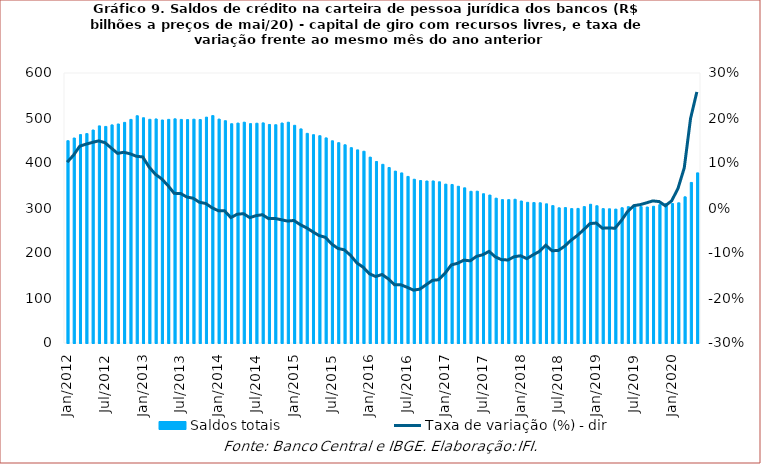
| Category | Saldos totais |
|---|---|
| 2012-01-01 | 449520.722 |
| 2012-02-01 | 455551.553 |
| 2012-03-01 | 463106.888 |
| 2012-04-01 | 465357.991 |
| 2012-05-01 | 473297.544 |
| 2012-06-01 | 482456.472 |
| 2012-07-01 | 481275.551 |
| 2012-08-01 | 484661.368 |
| 2012-09-01 | 486735.577 |
| 2012-10-01 | 490306.154 |
| 2012-11-01 | 496904.44 |
| 2012-12-01 | 505027.411 |
| 2013-01-01 | 500543.018 |
| 2013-02-01 | 497140.703 |
| 2013-03-01 | 497882.756 |
| 2013-04-01 | 495564.796 |
| 2013-05-01 | 496972.941 |
| 2013-06-01 | 498158.016 |
| 2013-07-01 | 496830.326 |
| 2013-08-01 | 496494.828 |
| 2013-09-01 | 497350.198 |
| 2013-10-01 | 496574.227 |
| 2013-11-01 | 501893.82 |
| 2013-12-01 | 505313.9 |
| 2014-01-01 | 497538.409 |
| 2014-02-01 | 493976.41 |
| 2014-03-01 | 487267.089 |
| 2014-04-01 | 488702.93 |
| 2014-05-01 | 490690.538 |
| 2014-06-01 | 487501.077 |
| 2014-07-01 | 488387.025 |
| 2014-08-01 | 489110.746 |
| 2014-09-01 | 485590.829 |
| 2014-10-01 | 485049.859 |
| 2014-11-01 | 488806.976 |
| 2014-12-01 | 490628.91 |
| 2015-01-01 | 483769.554 |
| 2015-02-01 | 475777.7 |
| 2015-03-01 | 465870.388 |
| 2015-04-01 | 462899.902 |
| 2015-05-01 | 460663.857 |
| 2015-06-01 | 455766.111 |
| 2015-07-01 | 449345.375 |
| 2015-08-01 | 445150.156 |
| 2015-09-01 | 440480.486 |
| 2015-10-01 | 434076.195 |
| 2015-11-01 | 429170.149 |
| 2015-12-01 | 426114.634 |
| 2016-01-01 | 413055.051 |
| 2016-02-01 | 403336.379 |
| 2016-03-01 | 397077.782 |
| 2016-04-01 | 390030.519 |
| 2016-05-01 | 381968.944 |
| 2016-06-01 | 377983.191 |
| 2016-07-01 | 370149.355 |
| 2016-08-01 | 363892.106 |
| 2016-09-01 | 361053.216 |
| 2016-10-01 | 360019.333 |
| 2016-11-01 | 360130.678 |
| 2016-12-01 | 358220.781 |
| 2017-01-01 | 353042.983 |
| 2017-02-01 | 352280.429 |
| 2017-03-01 | 348293.468 |
| 2017-04-01 | 344850.662 |
| 2017-05-01 | 337122.494 |
| 2017-06-01 | 337326.989 |
| 2017-07-01 | 331687.671 |
| 2017-08-01 | 328804.233 |
| 2017-09-01 | 321829.934 |
| 2017-10-01 | 318615.211 |
| 2017-11-01 | 318565.311 |
| 2017-12-01 | 319426.529 |
| 2018-01-01 | 315571.509 |
| 2018-02-01 | 312625.475 |
| 2018-03-01 | 312064.467 |
| 2018-04-01 | 311587.24 |
| 2018-05-01 | 309262.398 |
| 2018-06-01 | 305287.78 |
| 2018-07-01 | 300392.939 |
| 2018-08-01 | 300903.792 |
| 2018-09-01 | 298706.414 |
| 2018-10-01 | 299096.114 |
| 2018-11-01 | 303092.273 |
| 2018-12-01 | 308312.738 |
| 2019-01-01 | 305043.606 |
| 2019-02-01 | 298607.893 |
| 2019-03-01 | 298210.224 |
| 2019-04-01 | 297581.055 |
| 2019-05-01 | 300549.483 |
| 2019-06-01 | 302889.968 |
| 2019-07-01 | 301967.676 |
| 2019-08-01 | 303145.915 |
| 2019-09-01 | 302123.056 |
| 2019-10-01 | 303805.467 |
| 2019-11-01 | 307431.325 |
| 2019-12-01 | 309863.306 |
| 2020-01-01 | 309928.444 |
| 2020-02-01 | 311523.713 |
| 2020-03-01 | 324793.332 |
| 2020-04-01 | 356787.122 |
| 2020-05-01 | 378064 |